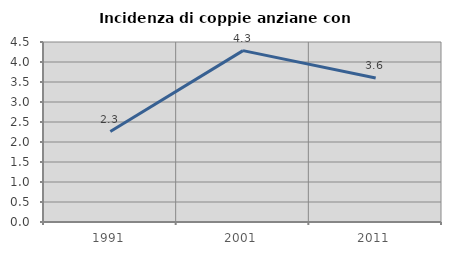
| Category | Incidenza di coppie anziane con figli |
|---|---|
| 1991.0 | 2.261 |
| 2001.0 | 4.284 |
| 2011.0 | 3.599 |